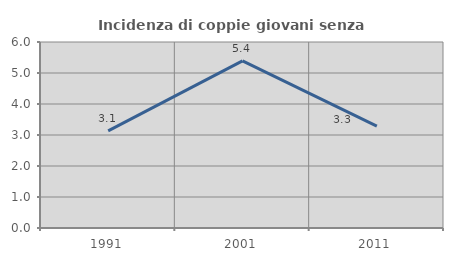
| Category | Incidenza di coppie giovani senza figli |
|---|---|
| 1991.0 | 3.135 |
| 2001.0 | 5.393 |
| 2011.0 | 3.284 |